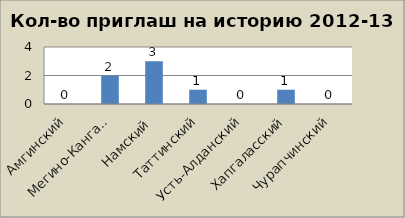
| Category | Series 0 |
|---|---|
| Амгинский | 0 |
| Мегино-Кангаласский | 2 |
| Намский | 3 |
| Таттинский | 1 |
| Усть-Алданский | 0 |
| Хапгаласский | 1 |
| Чурапчинский | 0 |